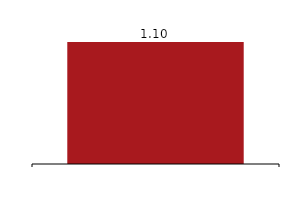
| Category | Earnings per share |
|---|---|
|  | 1.1 |